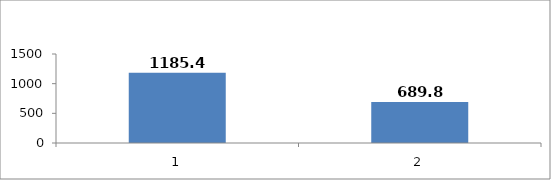
| Category | Series 0 |
|---|---|
| 0 | 1185.4 |
| 1 | 689.8 |